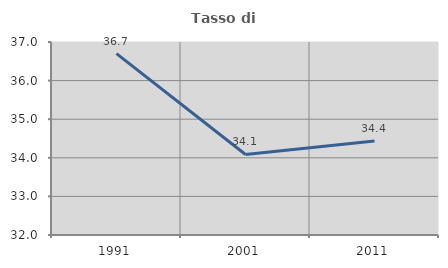
| Category | Tasso di occupazione   |
|---|---|
| 1991.0 | 36.699 |
| 2001.0 | 34.086 |
| 2011.0 | 34.438 |